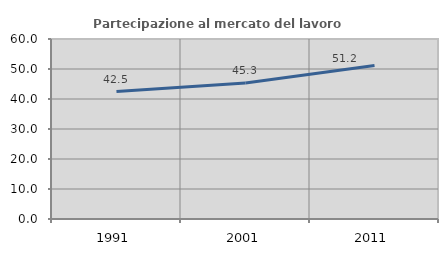
| Category | Partecipazione al mercato del lavoro  femminile |
|---|---|
| 1991.0 | 42.498 |
| 2001.0 | 45.338 |
| 2011.0 | 51.175 |